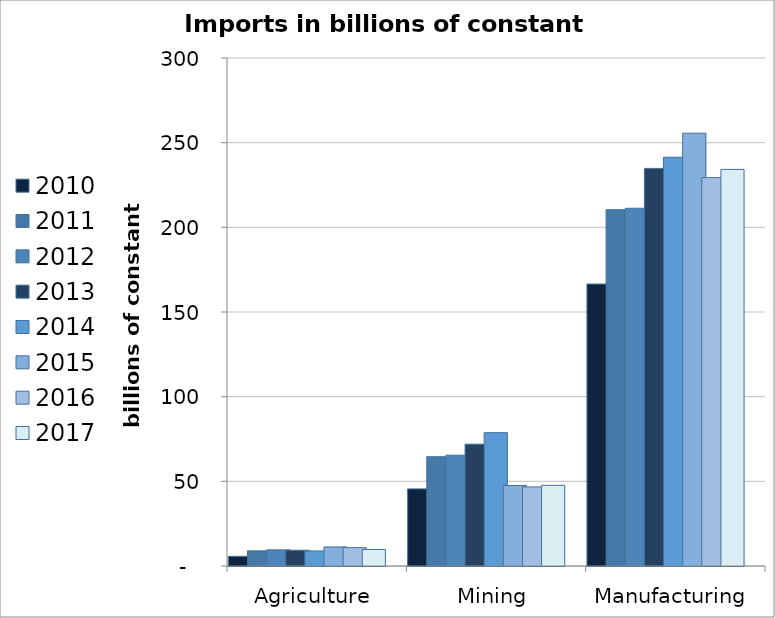
| Category | 2010 | 2011 | 2012 | 2013 | 2014 | 2015 | 2016 | 2017 | Series 8 |
|---|---|---|---|---|---|---|---|---|---|
|  Agriculture  | 5.699 | 8.954 | 9.526 | 9.305 | 8.882 | 11.255 | 10.838 | 9.73 |  |
|  Mining  | 45.545 | 64.539 | 65.423 | 71.965 | 78.746 | 47.538 | 46.701 | 47.619 |  |
|  Manufacturing  | 166.511 | 210.392 | 211.261 | 234.807 | 241.392 | 255.588 | 229.355 | 234.215 |  |